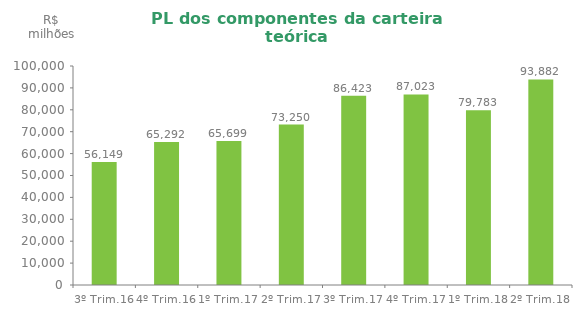
| Category | Series 0 |
|---|---|
| 3º Trim.16 | 56148.604 |
| 4º Trim.16 | 65292.199 |
| 1º Trim.17 | 65699.44 |
| 2º Trim.17 | 73250.496 |
| 3º Trim.17 | 86422.542 |
| 4º Trim.17 | 87022.625 |
| 1º Trim.18 | 79783.188 |
| 2º Trim.18 | 93882.016 |